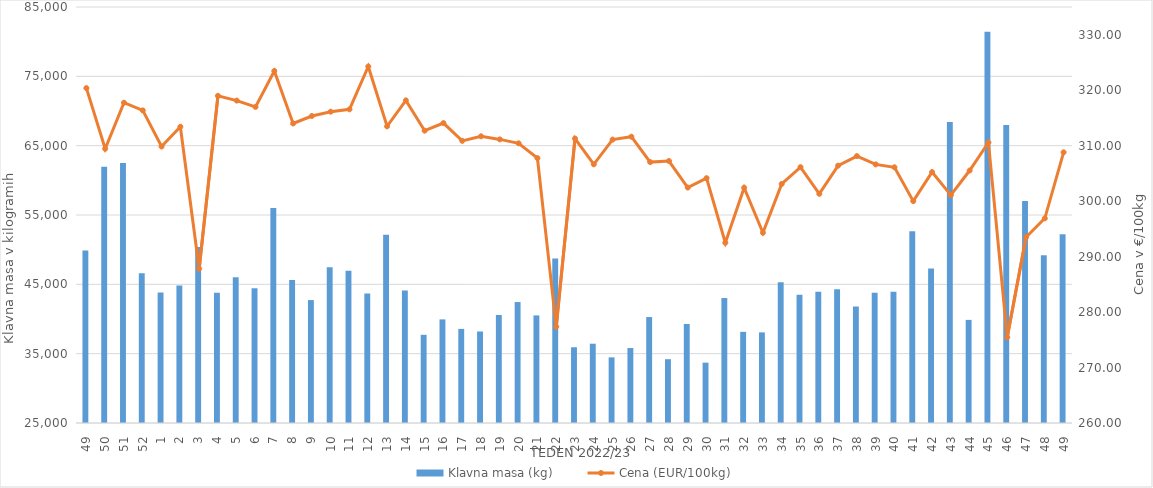
| Category | Klavna masa (kg) |
|---|---|
| 49.0 | 49873 |
| 50.0 | 61942 |
| 51.0 | 62514 |
| 52.0 | 46589 |
| 1.0 | 43807 |
| 2.0 | 44834 |
| 3.0 | 50386 |
| 4.0 | 43773 |
| 5.0 | 46011 |
| 6.0 | 44439 |
| 7.0 | 56001 |
| 8.0 | 45613 |
| 9.0 | 42730 |
| 10.0 | 47471 |
| 11.0 | 46952 |
| 12.0 | 43683 |
| 13.0 | 52135 |
| 14.0 | 44103 |
| 15.0 | 37719 |
| 16.0 | 39943 |
| 17.0 | 38574 |
| 18.0 | 38200 |
| 19.0 | 40581 |
| 20.0 | 42443 |
| 21.0 | 40517 |
| 22.0 | 48742 |
| 23.0 | 35927 |
| 24.0 | 36436 |
| 25.0 | 34463 |
| 26.0 | 35812 |
| 27.0 | 40280 |
| 28.0 | 34201 |
| 29.0 | 39279 |
| 30.0 | 33702 |
| 31.0 | 43020 |
| 32.0 | 38146 |
| 33.0 | 38070 |
| 34.0 | 45290 |
| 35.0 | 43513 |
| 36.0 | 43945 |
| 37.0 | 44302 |
| 38.0 | 41798 |
| 39.0 | 43790 |
| 40.0 | 43913 |
| 41.0 | 52663 |
| 42.0 | 47275 |
| 43.0 | 68419 |
| 44.0 | 39872 |
| 45.0 | 81439 |
| 46.0 | 67983 |
| 47.0 | 57006 |
| 48.0 | 49204 |
| 49.0 | 52219 |